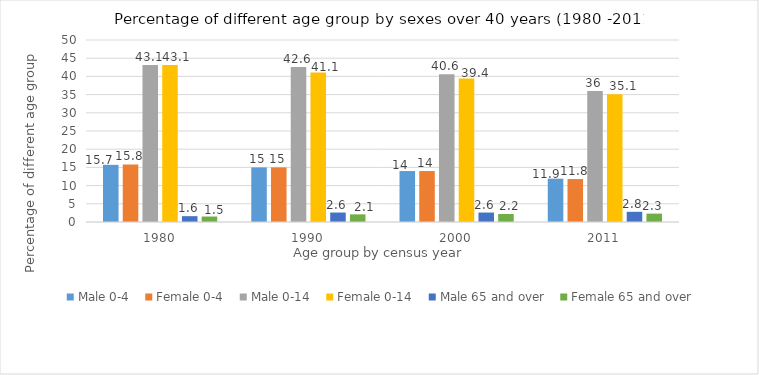
| Category | Male | Female |
|---|---|---|
| 1980.0 | 1.6 | 1.5 |
| 1990.0 | 2.6 | 2.1 |
| 2000.0 | 2.6 | 2.2 |
| 2011.0 | 2.8 | 2.3 |